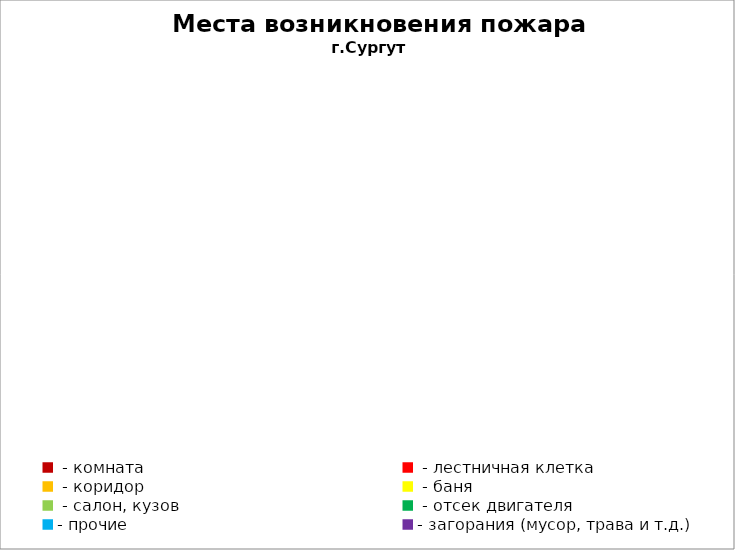
| Category | Места возникновения пожара |
|---|---|
|  - комната | 52 |
|  - лестничная клетка | 26 |
|  - коридор | 9 |
|  - баня | 28 |
|  - салон, кузов | 10 |
|  - отсек двигателя | 33 |
| - прочие | 131 |
| - загорания (мусор, трава и т.д.)  | 168 |